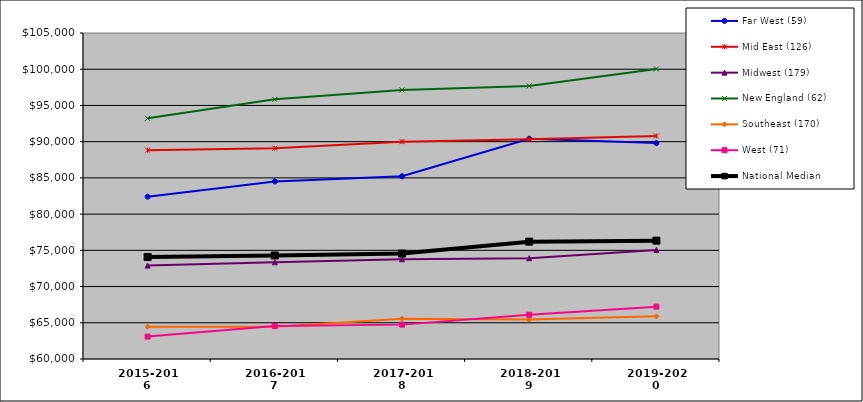
| Category | Far West (59) | Mid East (126) | Midwest (179) | New England (62) | Southeast (170) | West (71) | National Median |
|---|---|---|---|---|---|---|---|
| 2015-2016 | 82404 | 88830 | 72891 | 93217.5 | 64444.5 | 63090 | 74088 |
| 2016-2017 | 84509 | 89081.5 | 73350 | 95839.5 | 64451 | 64561 | 74288 |
| 2017-2018 | 85219 | 90002 | 73765 | 97146.5 | 65560 | 64745 | 74555 |
| 2018-2019 | 90396 | 90327 | 73911 | 97694.5 | 65443 | 66107 | 76199 |
| 2019-2020 | 89799 | 90781 | 75057 | 100039 | 65888 | 67222 | 76337 |